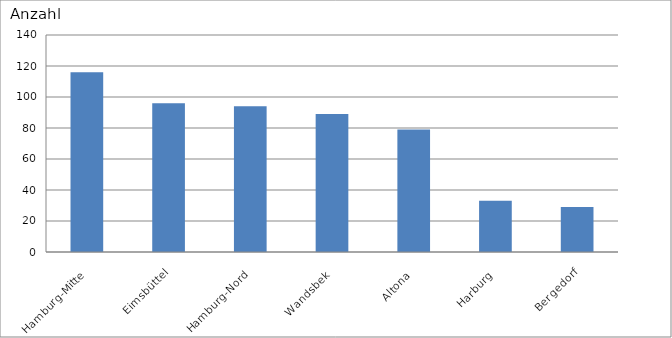
| Category | Hamburg-Mitte |
|---|---|
| Hamburg-Mitte | 116 |
| Eimsbüttel | 96 |
| Hamburg-Nord | 94 |
| Wandsbek | 89 |
| Altona | 79 |
| Harburg | 33 |
| Bergedorf | 29 |